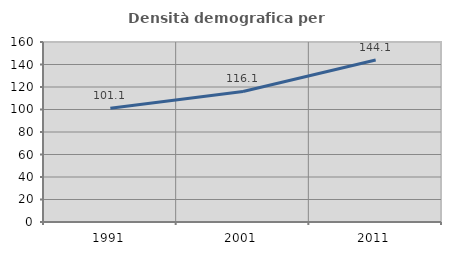
| Category | Densità demografica |
|---|---|
| 1991.0 | 101.074 |
| 2001.0 | 116.061 |
| 2011.0 | 144.055 |